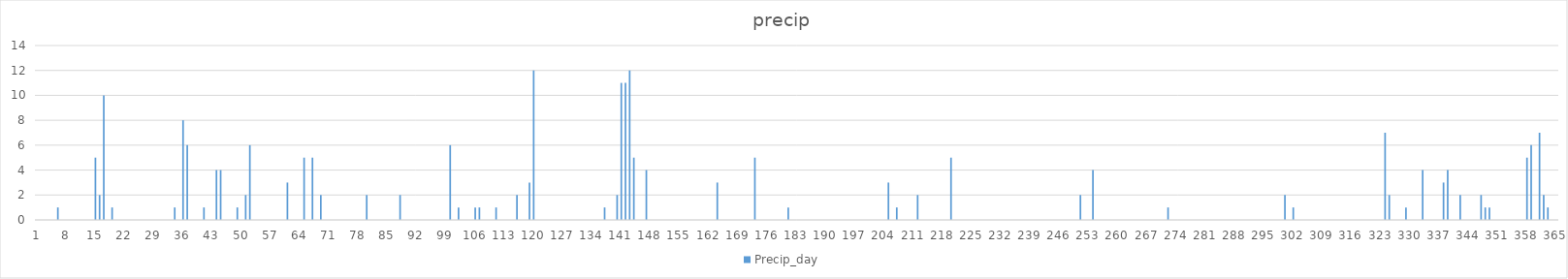
| Category | Precip_day |
|---|---|
| 0 | 0 |
| 1 | 0 |
| 2 | 0 |
| 3 | 0 |
| 4 | 0 |
| 5 | 1 |
| 6 | 0 |
| 7 | 0 |
| 8 | 0 |
| 9 | 0 |
| 10 | 0 |
| 11 | 0 |
| 12 | 0 |
| 13 | 0 |
| 14 | 5 |
| 15 | 2 |
| 16 | 10 |
| 17 | 0 |
| 18 | 1 |
| 19 | 0 |
| 20 | 0 |
| 21 | 0 |
| 22 | 0 |
| 23 | 0 |
| 24 | 0 |
| 25 | 0 |
| 26 | 0 |
| 27 | 0 |
| 28 | 0 |
| 29 | 0 |
| 30 | 0 |
| 31 | 0 |
| 32 | 0 |
| 33 | 1 |
| 34 | 0 |
| 35 | 8 |
| 36 | 6 |
| 37 | 0 |
| 38 | 0 |
| 39 | 0 |
| 40 | 1 |
| 41 | 0 |
| 42 | 0 |
| 43 | 4 |
| 44 | 4 |
| 45 | 0 |
| 46 | 0 |
| 47 | 0 |
| 48 | 1 |
| 49 | 0 |
| 50 | 2 |
| 51 | 6 |
| 52 | 0 |
| 53 | 0 |
| 54 | 0 |
| 55 | 0 |
| 56 | 0 |
| 57 | 0 |
| 58 | 0 |
| 59 | 0 |
| 60 | 3 |
| 61 | 0 |
| 62 | 0 |
| 63 | 0 |
| 64 | 5 |
| 65 | 0 |
| 66 | 5 |
| 67 | 0 |
| 68 | 2 |
| 69 | 0 |
| 70 | 0 |
| 71 | 0 |
| 72 | 0 |
| 73 | 0 |
| 74 | 0 |
| 75 | 0 |
| 76 | 0 |
| 77 | 0 |
| 78 | 0 |
| 79 | 2 |
| 80 | 0 |
| 81 | 0 |
| 82 | 0 |
| 83 | 0 |
| 84 | 0 |
| 85 | 0 |
| 86 | 0 |
| 87 | 2 |
| 88 | 0 |
| 89 | 0 |
| 90 | 0 |
| 91 | 0 |
| 92 | 0 |
| 93 | 0 |
| 94 | 0 |
| 95 | 0 |
| 96 | 0 |
| 97 | 0 |
| 98 | 0 |
| 99 | 6 |
| 100 | 0 |
| 101 | 1 |
| 102 | 0 |
| 103 | 0 |
| 104 | 0 |
| 105 | 1 |
| 106 | 1 |
| 107 | 0 |
| 108 | 0 |
| 109 | 0 |
| 110 | 1 |
| 111 | 0 |
| 112 | 0 |
| 113 | 0 |
| 114 | 0 |
| 115 | 2 |
| 116 | 0 |
| 117 | 0 |
| 118 | 3 |
| 119 | 12 |
| 120 | 0 |
| 121 | 0 |
| 122 | 0 |
| 123 | 0 |
| 124 | 0 |
| 125 | 0 |
| 126 | 0 |
| 127 | 0 |
| 128 | 0 |
| 129 | 0 |
| 130 | 0 |
| 131 | 0 |
| 132 | 0 |
| 133 | 0 |
| 134 | 0 |
| 135 | 0 |
| 136 | 1 |
| 137 | 0 |
| 138 | 0 |
| 139 | 2 |
| 140 | 11 |
| 141 | 11 |
| 142 | 12 |
| 143 | 5 |
| 144 | 0 |
| 145 | 0 |
| 146 | 4 |
| 147 | 0 |
| 148 | 0 |
| 149 | 0 |
| 150 | 0 |
| 151 | 0 |
| 152 | 0 |
| 153 | 0 |
| 154 | 0 |
| 155 | 0 |
| 156 | 0 |
| 157 | 0 |
| 158 | 0 |
| 159 | 0 |
| 160 | 0 |
| 161 | 0 |
| 162 | 0 |
| 163 | 3 |
| 164 | 0 |
| 165 | 0 |
| 166 | 0 |
| 167 | 0 |
| 168 | 0 |
| 169 | 0 |
| 170 | 0 |
| 171 | 0 |
| 172 | 5 |
| 173 | 0 |
| 174 | 0 |
| 175 | 0 |
| 176 | 0 |
| 177 | 0 |
| 178 | 0 |
| 179 | 0 |
| 180 | 1 |
| 181 | 0 |
| 182 | 0 |
| 183 | 0 |
| 184 | 0 |
| 185 | 0 |
| 186 | 0 |
| 187 | 0 |
| 188 | 0 |
| 189 | 0 |
| 190 | 0 |
| 191 | 0 |
| 192 | 0 |
| 193 | 0 |
| 194 | 0 |
| 195 | 0 |
| 196 | 0 |
| 197 | 0 |
| 198 | 0 |
| 199 | 0 |
| 200 | 0 |
| 201 | 0 |
| 202 | 0 |
| 203 | 0 |
| 204 | 3 |
| 205 | 0 |
| 206 | 1 |
| 207 | 0 |
| 208 | 0 |
| 209 | 0 |
| 210 | 0 |
| 211 | 2 |
| 212 | 0 |
| 213 | 0 |
| 214 | 0 |
| 215 | 0 |
| 216 | 0 |
| 217 | 0 |
| 218 | 0 |
| 219 | 5 |
| 220 | 0 |
| 221 | 0 |
| 222 | 0 |
| 223 | 0 |
| 224 | 0 |
| 225 | 0 |
| 226 | 0 |
| 227 | 0 |
| 228 | 0 |
| 229 | 0 |
| 230 | 0 |
| 231 | 0 |
| 232 | 0 |
| 233 | 0 |
| 234 | 0 |
| 235 | 0 |
| 236 | 0 |
| 237 | 0 |
| 238 | 0 |
| 239 | 0 |
| 240 | 0 |
| 241 | 0 |
| 242 | 0 |
| 243 | 0 |
| 244 | 0 |
| 245 | 0 |
| 246 | 0 |
| 247 | 0 |
| 248 | 0 |
| 249 | 0 |
| 250 | 2 |
| 251 | 0 |
| 252 | 0 |
| 253 | 4 |
| 254 | 0 |
| 255 | 0 |
| 256 | 0 |
| 257 | 0 |
| 258 | 0 |
| 259 | 0 |
| 260 | 0 |
| 261 | 0 |
| 262 | 0 |
| 263 | 0 |
| 264 | 0 |
| 265 | 0 |
| 266 | 0 |
| 267 | 0 |
| 268 | 0 |
| 269 | 0 |
| 270 | 0 |
| 271 | 1 |
| 272 | 0 |
| 273 | 0 |
| 274 | 0 |
| 275 | 0 |
| 276 | 0 |
| 277 | 0 |
| 278 | 0 |
| 279 | 0 |
| 280 | 0 |
| 281 | 0 |
| 282 | 0 |
| 283 | 0 |
| 284 | 0 |
| 285 | 0 |
| 286 | 0 |
| 287 | 0 |
| 288 | 0 |
| 289 | 0 |
| 290 | 0 |
| 291 | 0 |
| 292 | 0 |
| 293 | 0 |
| 294 | 0 |
| 295 | 0 |
| 296 | 0 |
| 297 | 0 |
| 298 | 0 |
| 299 | 2 |
| 300 | 0 |
| 301 | 1 |
| 302 | 0 |
| 303 | 0 |
| 304 | 0 |
| 305 | 0 |
| 306 | 0 |
| 307 | 0 |
| 308 | 0 |
| 309 | 0 |
| 310 | 0 |
| 311 | 0 |
| 312 | 0 |
| 313 | 0 |
| 314 | 0 |
| 315 | 0 |
| 316 | 0 |
| 317 | 0 |
| 318 | 0 |
| 319 | 0 |
| 320 | 0 |
| 321 | 0 |
| 322 | 0 |
| 323 | 7 |
| 324 | 2 |
| 325 | 0 |
| 326 | 0 |
| 327 | 0 |
| 328 | 1 |
| 329 | 0 |
| 330 | 0 |
| 331 | 0 |
| 332 | 4 |
| 333 | 0 |
| 334 | 0 |
| 335 | 0 |
| 336 | 0 |
| 337 | 3 |
| 338 | 4 |
| 339 | 0 |
| 340 | 0 |
| 341 | 2 |
| 342 | 0 |
| 343 | 0 |
| 344 | 0 |
| 345 | 0 |
| 346 | 2 |
| 347 | 1 |
| 348 | 1 |
| 349 | 0 |
| 350 | 0 |
| 351 | 0 |
| 352 | 0 |
| 353 | 0 |
| 354 | 0 |
| 355 | 0 |
| 356 | 0 |
| 357 | 5 |
| 358 | 6 |
| 359 | 0 |
| 360 | 7 |
| 361 | 2 |
| 362 | 1 |
| 363 | 0 |
| 364 | 0 |